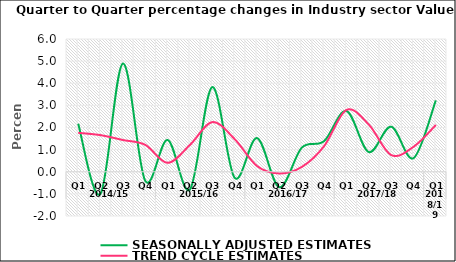
| Category | SEASONALLY ADJUSTED ESTIMATES | TREND CYCLE ESTIMATES |
|---|---|---|
| 0 | 2.169 | 1.76 |
| 1 | -0.994 | 1.655 |
| 2 | 4.89 | 1.434 |
| 3 | -0.41 | 1.216 |
| 4 | 1.438 | 0.403 |
| 5 | -0.801 | 1.212 |
| 6 | 3.826 | 2.242 |
| 7 | -0.273 | 1.477 |
| 8 | 1.523 | 0.26 |
| 9 | -0.7 | -0.077 |
| 10 | 1.085 | 0.215 |
| 11 | 1.383 | 1.153 |
| 12 | 2.75 | 2.793 |
| 13 | 0.891 | 2.135 |
| 14 | 2.036 | 0.756 |
| 15 | 0.611 | 1.126 |
| 16 | 3.223 | 2.111 |